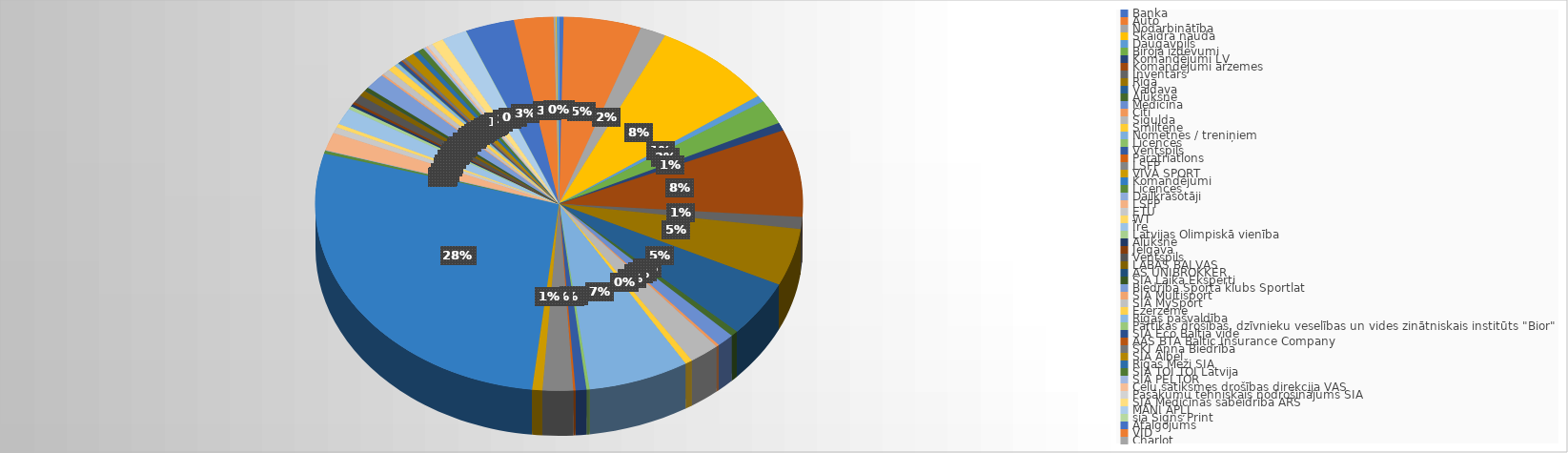
| Category | Series 0 |
|---|---|
| Banka | 284.66 |
| Auto | 4815.27 |
| Nodarbinātība | 1608.92 |
| Skaidra nauda | 7529 |
| Daugavpils | 542.3 |
| Biroja izdevumi | 1965.78 |
| Komandējumi LV | 639 |
| Komandējumi ārzemes | 7090.82 |
| Inventārs | 972.35 |
| Rīga | 4621.03 |
| Vaidava | 4575.33 |
| Alūksne | 456.89 |
| Medicīna | 1078.09 |
| Citi | 192.5 |
| Sigulda | 1874.49 |
| Smiltene | 450 |
| Nometnes / treniņiem | 6255 |
| Licences | 200.38 |
| Ventspils | 674.2 |
| Paratriatlons | 133.99 |
| LSFP | 1893.4 |
| VIVA SPORT | 633.55 |
| Komandējumi | 25827.17 |
| Licences | 246.29 |
| Daiļkrāsotāji | 30.25 |
| LSFP | 1458.67 |
| ETU | 500 |
| WT | 282 |
| Īre | 1350.67 |
| Latvijas Olimpiskā vienība | 250 |
| Alūksne | 200 |
| Jelgava | 200 |
| Ventspils | 631.84 |
| LABĀS BALVAS | 470 |
| AS UNIBROKKER | 30 |
| SIA Laika Eksperti | 280.16 |
| Biedrība Sporta klubs Sportlat | 1286 |
| SIA Multisport | 134.98 |
| SIA MySport | 491.95 |
| Ezerzeme | 490 |
| Rīgas pašvaldība | 248.94 |
| Pārtikas drošības, dzīvnieku veselības un vides zinātniskais institūts "Bior" | 48.02 |
| SIA Eco Baltia vide | 248.95 |
| AAS BTA Baltic Insurance Company | 88.09 |
| SKI Anna Biedrība | 230 |
| SIA Albel | 605 |
| Rīgas Meži SIA | 363 |
| SIA TOI TOI Latvija | 385.39 |
| SIA PELTOR | 181.5 |
| Ceļu satiksmes drošības direkcija VAS | 150.65 |
| Pasākumu tehniskais nodrošinājums SIA | 319.44 |
| SIA Medicīnas sabeidrība ARS | 739.4 |
| MANI APĻI | 1574.93 |
| sia Signs Print | 5 |
| Atalgojums | 3048.96 |
| VID | 2444.08 |
| Charlot | 150.41 |
| VAS "Elektroniskie sakari " | 41.08 |
| Sabiedrība ar ierobežotu atbildību "DIGITĀLĀ PELE" | 145.2 |